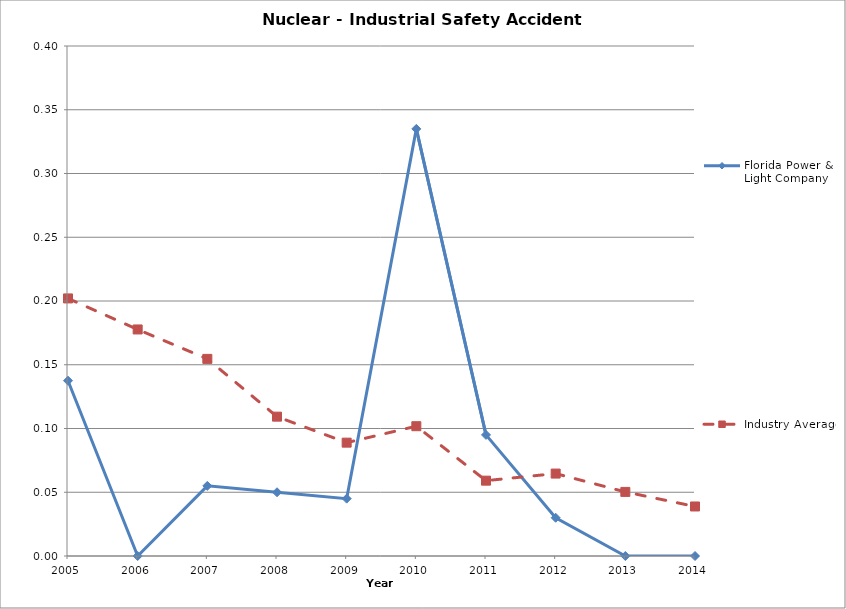
| Category | Florida Power & Light Company | Industry Average |
|---|---|---|
| 2005.0 | 0.137 | 0.202 |
| 2006.0 | 0 | 0.178 |
| 2007.0 | 0.055 | 0.155 |
| 2008.0 | 0.05 | 0.109 |
| 2009.0 | 0.045 | 0.089 |
| 2010.0 | 0.335 | 0.102 |
| 2011.0 | 0.095 | 0.059 |
| 2012.0 | 0.03 | 0.065 |
| 2013.0 | 0 | 0.05 |
| 2014.0 | 0 | 0.039 |